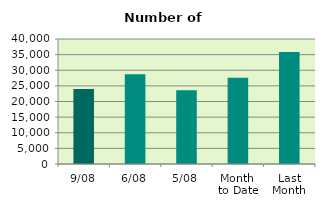
| Category | Series 0 |
|---|---|
| 9/08 | 23962 |
| 6/08 | 28730 |
| 5/08 | 23568 |
| Month 
to Date | 27620.333 |
| Last
Month | 35875.545 |